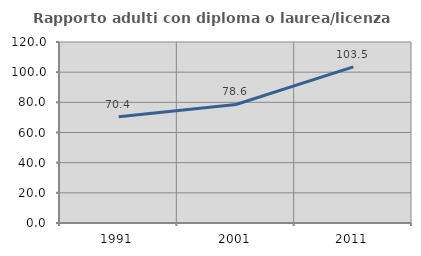
| Category | Rapporto adulti con diploma o laurea/licenza media  |
|---|---|
| 1991.0 | 70.37 |
| 2001.0 | 78.571 |
| 2011.0 | 103.542 |